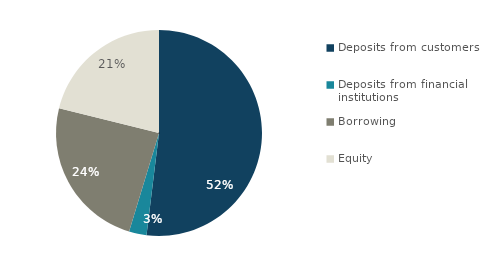
| Category | Series 0 |
|---|---|
| Deposits from customers | 605158 |
| Deposits from financial institutions | 32062 |
| Borrowing | 281874 |
| Equity | 246057 |